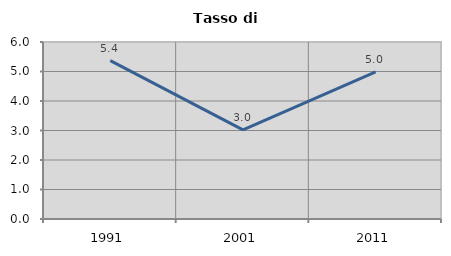
| Category | Tasso di disoccupazione   |
|---|---|
| 1991.0 | 5.369 |
| 2001.0 | 3.021 |
| 2011.0 | 4.989 |